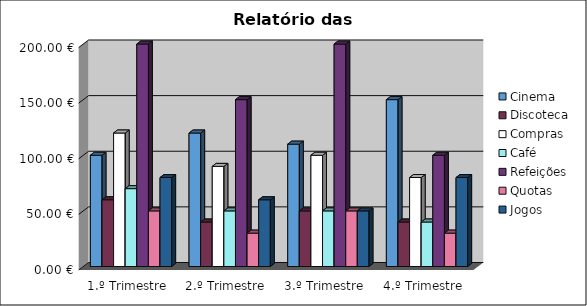
| Category | Cinema | Discoteca | Compras | Café | Refeições | Quotas | Jogos |
|---|---|---|---|---|---|---|---|
| 1.º Trimestre | 100 | 60 | 120 | 70 | 200 | 50 | 80 |
| 2.º Trimestre | 120 | 40 | 90 | 50 | 150 | 30 | 60 |
| 3.º Trimestre | 110 | 50 | 100 | 50 | 200 | 50 | 50 |
| 4.º Trimestre | 150 | 40 | 80 | 40 | 100 | 30 | 80 |